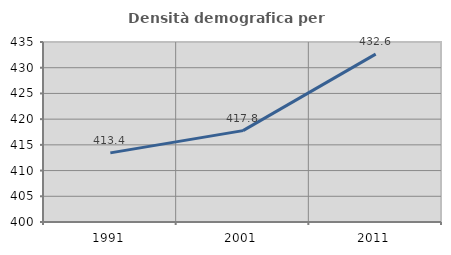
| Category | Densità demografica |
|---|---|
| 1991.0 | 413.438 |
| 2001.0 | 417.767 |
| 2011.0 | 432.638 |